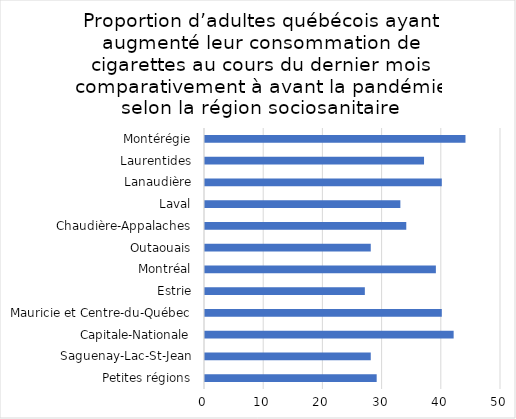
| Category | Series 0 |
|---|---|
| Petites régions | 29 |
| Saguenay-Lac-St-Jean | 28 |
| Capitale-Nationale | 42 |
| Mauricie et Centre-du-Québec | 40 |
| Estrie | 27 |
| Montréal | 39 |
| Outaouais | 28 |
| Chaudière-Appalaches | 34 |
| Laval | 33 |
| Lanaudière | 40 |
| Laurentides | 37 |
| Montérégie | 44 |